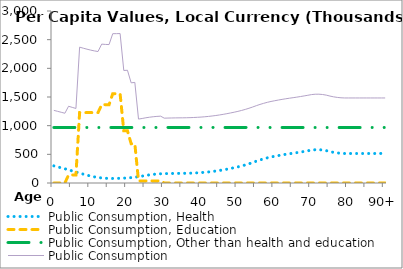
| Category | Public Consumption, Health | Public Consumption, Education | Public Consumption, Other than health and education | Public Consumption |
|---|---|---|---|---|
| 0 | 298511.937 | 0 | 968337.145 | 1266849.082 |
|  | 281885.664 | 0 | 968337.145 | 1250222.809 |
| 2 | 265259.391 | 0 | 968337.145 | 1233596.536 |
| 3 | 248444.426 | 0 | 968337.145 | 1216781.571 |
| 4 | 230093.641 | 140322.926 | 968337.145 | 1338753.712 |
| 5 | 210274.482 | 140322.926 | 968337.145 | 1318934.552 |
| 6 | 191416.244 | 140322.926 | 968337.145 | 1300076.314 |
| 7 | 172689.083 | 1228600.624 | 968337.145 | 2369626.852 |
| 8 | 154421.298 | 1228600.624 | 968337.145 | 2351359.067 |
| 9 | 137183.833 | 1228600.624 | 968337.145 | 2334121.602 |
| 10 | 120939.423 | 1228600.624 | 968337.145 | 2317877.192 |
| 11 | 107216.119 | 1228600.624 | 968337.145 | 2304153.888 |
| 12 | 96194.583 | 1228600.624 | 968337.145 | 2293132.352 |
| 13 | 87993.493 | 1366098.324 | 968337.145 | 2422428.962 |
| 14 | 82556.546 | 1366098.324 | 968337.145 | 2416992.015 |
| 15 | 80132.364 | 1366098.324 | 968337.145 | 2414567.834 |
| 16 | 79279.995 | 1556804.347 | 968337.145 | 2604421.487 |
| 17 | 79857.077 | 1556804.347 | 968337.145 | 2604998.569 |
| 18 | 81713.225 | 1556804.347 | 968337.145 | 2606854.717 |
| 19 | 84568.604 | 909840.699 | 968337.145 | 1962746.449 |
| 20 | 88362.67 | 909840.699 | 968337.145 | 1966540.514 |
| 21 | 93944.904 | 684817.981 | 968337.145 | 1747100.03 |
| 22 | 101147.145 | 684817.981 | 968337.145 | 1754302.271 |
| 23 | 109903.458 | 36873.275 | 968337.145 | 1115113.878 |
| 24 | 120285.657 | 36873.275 | 968337.145 | 1125496.078 |
| 25 | 132342.527 | 36873.275 | 968337.145 | 1137552.947 |
| 26 | 142343.503 | 36873.275 | 968337.145 | 1147553.924 |
| 27 | 150397.749 | 36873.275 | 968337.145 | 1155608.169 |
| 28 | 156454.648 | 36873.275 | 968337.145 | 1161665.068 |
| 29 | 160497.763 | 36873.275 | 968337.145 | 1165708.184 |
| 30 | 162613.627 | 0 | 968337.145 | 1130950.772 |
| 31 | 164417.958 | 0 | 968337.145 | 1132755.103 |
| 32 | 165894.227 | 0 | 968337.145 | 1134231.372 |
| 33 | 167049.59 | 0 | 968337.145 | 1135386.735 |
| 34 | 167889.109 | 0 | 968337.145 | 1136226.254 |
| 35 | 168408.067 | 0 | 968337.145 | 1136745.212 |
| 36 | 169621.877 | 0 | 968337.145 | 1137959.022 |
| 37 | 171535.04 | 0 | 968337.145 | 1139872.185 |
| 38 | 174178.375 | 0 | 968337.145 | 1142515.52 |
| 39 | 177540.707 | 0 | 968337.145 | 1145877.852 |
| 40 | 181573.287 | 0 | 968337.145 | 1149910.432 |
| 41 | 186710.087 | 0 | 968337.145 | 1155047.232 |
| 42 | 192992.449 | 0 | 968337.145 | 1161329.594 |
| 43 | 200410.934 | 0 | 968337.145 | 1168748.079 |
| 44 | 208878.953 | 0 | 968337.145 | 1177216.098 |
| 45 | 218479.603 | 0 | 968337.145 | 1186816.748 |
| 46 | 229115.415 | 0 | 968337.145 | 1197452.56 |
| 47 | 240697.005 | 0 | 968337.145 | 1209034.15 |
| 48 | 253172.667 | 0 | 968337.145 | 1221509.812 |
| 49 | 266680.097 | 0 | 968337.145 | 1235017.242 |
| 50 | 281130.369 | 0 | 968337.145 | 1249467.514 |
| 51 | 297224.535 | 0 | 968337.145 | 1265561.68 |
| 52 | 315236.117 | 0 | 968337.145 | 1283573.262 |
| 53 | 335152.525 | 0 | 968337.145 | 1303489.67 |
| 54 | 356834.099 | 0 | 968337.145 | 1325171.244 |
| 55 | 380598.934 | 0 | 968337.145 | 1348936.079 |
| 56 | 402087.52 | 0 | 968337.145 | 1370424.665 |
| 57 | 421513.725 | 0 | 968337.145 | 1389850.87 |
| 58 | 438821.41 | 0 | 968337.145 | 1407158.555 |
| 59 | 453873.795 | 0 | 968337.145 | 1422210.94 |
| 60 | 466610.684 | 0 | 968337.145 | 1434947.829 |
| 61 | 478717.825 | 0 | 968337.145 | 1447054.97 |
| 62 | 490073.201 | 0 | 968337.145 | 1458410.346 |
| 63 | 500696.956 | 0 | 968337.145 | 1469034.101 |
| 64 | 510610.433 | 0 | 968337.145 | 1478947.579 |
| 65 | 519772.593 | 0 | 968337.145 | 1488109.738 |
| 66 | 529475.769 | 0 | 968337.145 | 1497812.914 |
| 67 | 539721.762 | 0 | 968337.145 | 1508058.907 |
| 68 | 550518.96 | 0 | 968337.145 | 1518856.105 |
| 69 | 561878.846 | 0 | 968337.145 | 1530215.991 |
| 70 | 573755.141 | 0 | 968337.145 | 1542092.286 |
| 71 | 580055.861 | 0 | 968337.145 | 1548393.006 |
| 72 | 580569.624 | 0 | 968337.145 | 1548906.769 |
| 73 | 575240.382 | 0 | 968337.145 | 1543577.527 |
| 74 | 564315.411 | 0 | 968337.145 | 1532652.556 |
| 75 | 547788.459 | 0 | 968337.145 | 1516125.604 |
| 76 | 534482.246 | 0 | 968337.145 | 1502819.391 |
| 77 | 524524.115 | 0 | 968337.145 | 1492861.26 |
| 78 | 517934.005 | 0 | 968337.145 | 1486271.15 |
| 79 | 514828.232 | 0 | 968337.145 | 1483165.377 |
| 80 | 514828.232 | 0 | 968337.145 | 1483165.377 |
| 81 | 514828.232 | 0 | 968337.145 | 1483165.377 |
| 82 | 514828.232 | 0 | 968337.145 | 1483165.377 |
| 83 | 514828.232 | 0 | 968337.145 | 1483165.377 |
| 84 | 514828.232 | 0 | 968337.145 | 1483165.377 |
| 85 | 514828.232 | 0 | 968337.145 | 1483165.377 |
| 86 | 514828.232 | 0 | 968337.145 | 1483165.377 |
| 87 | 514828.232 | 0 | 968337.145 | 1483165.377 |
| 88 | 514828.232 | 0 | 968337.145 | 1483165.377 |
| 89 | 514828.232 | 0 | 968337.145 | 1483165.377 |
| 90+ | 514828.232 | 0 | 968337.145 | 1483165.377 |